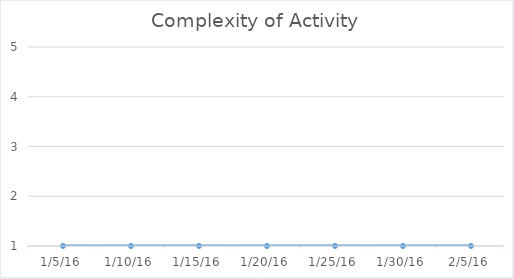
| Category | Series 0 |
|---|---|
| 1/5/16 | 1 |
| 1/10/16 | 1 |
| 1/15/16 | 1 |
| 1/20/16 | 1 |
| 1/25/16 | 1 |
| 1/30/16 | 1 |
| 2/5/16 | 1 |